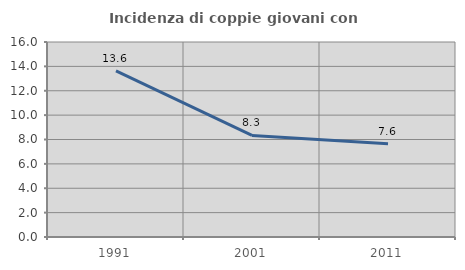
| Category | Incidenza di coppie giovani con figli |
|---|---|
| 1991.0 | 13.636 |
| 2001.0 | 8.333 |
| 2011.0 | 7.643 |